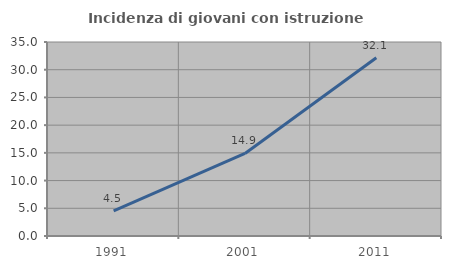
| Category | Incidenza di giovani con istruzione universitaria |
|---|---|
| 1991.0 | 4.545 |
| 2001.0 | 14.894 |
| 2011.0 | 32.143 |